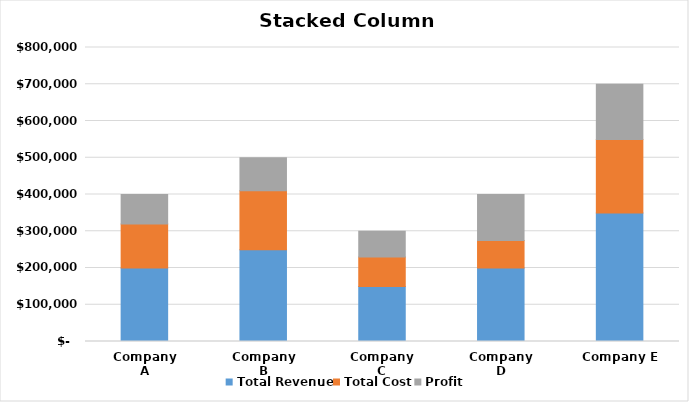
| Category | Total Revenue | Total Cost | Profit |
|---|---|---|---|
| Company A | 200000 | 120000 | 80000 |
| Company B | 250000 | 160000 | 90000 |
| Company C | 150000 | 80000 | 70000 |
| Company D | 200000 | 75000 | 125000 |
| Company E | 350000 | 200000 | 150000 |